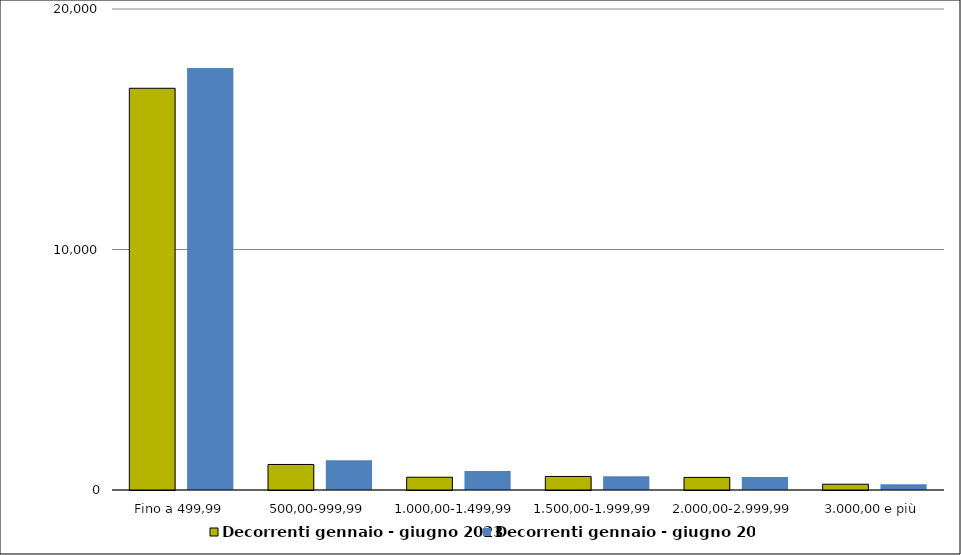
| Category | Decorrenti gennaio - giugno 2023 | Decorrenti gennaio - giugno 2022 |
|---|---|---|
|  Fino a 499,99  | 16704 | 17551 |
|  500,00-999,99  | 1061 | 1238 |
|  1.000,00-1.499,99  | 531 | 795 |
|  1.500,00-1.999,99  | 562 | 571 |
|  2.000,00-2.999,99  | 524 | 545 |
|  3.000,00 e più  | 240 | 239 |